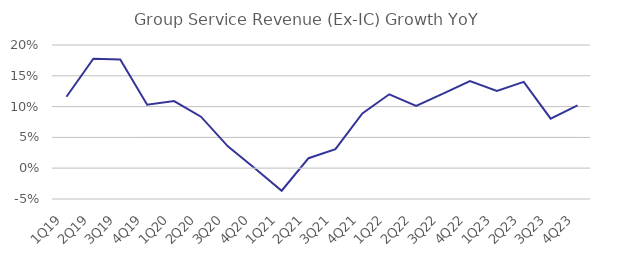
| Category | Group Service Revenue (Ex-IC) Growth YoY |
|---|---|
| 1Q19 | 0.116 |
| 2Q19 | 0.178 |
| 3Q19 | 0.176 |
| 4Q19 | 0.103 |
| 1Q20 | 0.109 |
| 2Q20 | 0.084 |
| 3Q20 | 0.036 |
| 4Q20 | 0 |
| 1Q21 | -0.037 |
| 2Q21 | 0.016 |
| 3Q21 | 0.031 |
| 4Q21 | 0.089 |
| 1Q22 | 0.12 |
| 2Q22 | 0.101 |
| 3Q22 | 0.121 |
| 4Q22 | 0.141 |
| 1Q23 | 0.125 |
| 2Q23 | 0.14 |
| 3Q23 | 0.08 |
| 4Q23 | 0.102 |